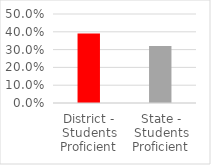
| Category | Series 2 |
|---|---|
| District - Students Proficient | 0.39 |
| State - Students Proficient | 0.32 |